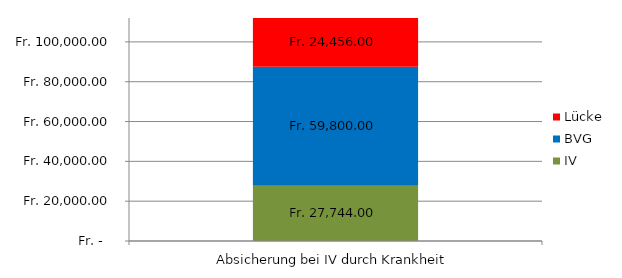
| Category | IV | BVG | Lücke |
|---|---|---|---|
| 0 | 27744 | 59800 | 24456 |